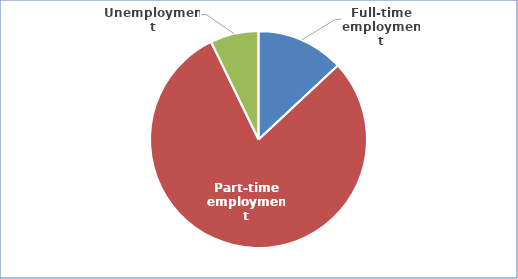
| Category | Series 0 |
|---|---|
| Full-time employment | 73.275 |
| Part-time employment | 448.138 |
| Unemployment | 40.488 |